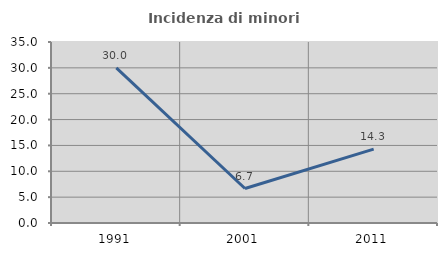
| Category | Incidenza di minori stranieri |
|---|---|
| 1991.0 | 30 |
| 2001.0 | 6.667 |
| 2011.0 | 14.286 |